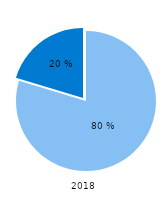
| Category | Series 0 |
|---|---|
| 0 | 0.796 |
| 1 | 0.204 |